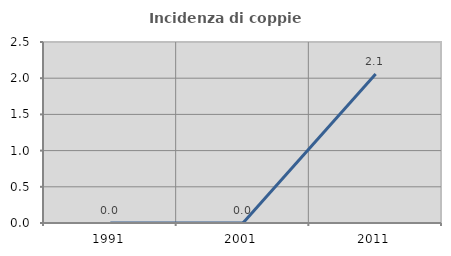
| Category | Incidenza di coppie miste |
|---|---|
| 1991.0 | 0 |
| 2001.0 | 0 |
| 2011.0 | 2.058 |